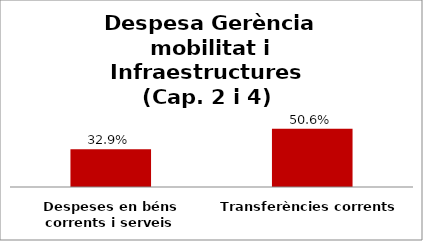
| Category | Series 0 |
|---|---|
| Despeses en béns corrents i serveis | 0.329 |
| Transferències corrents | 0.506 |